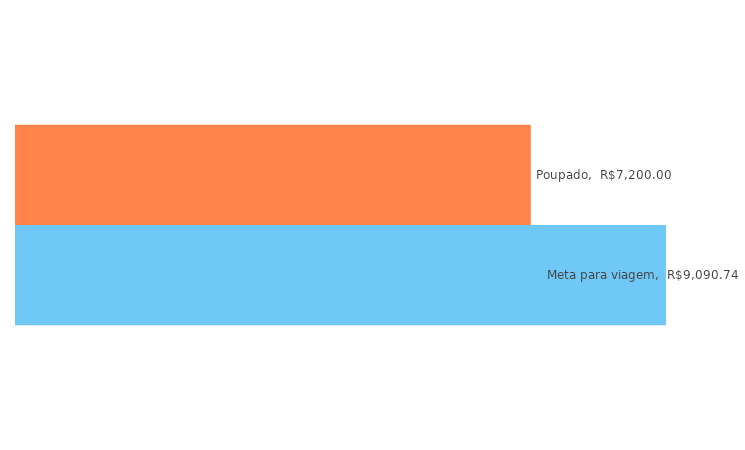
| Category | Meta para viagem | Poupado |
|---|---|---|
| 0 | 9090.743 | 7200 |